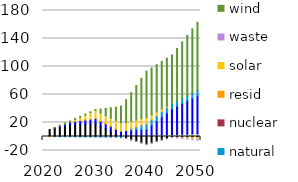
| Category | biomass | coal | hydro | natural gas | nuclear | resid | solar | waste | wind |
|---|---|---|---|---|---|---|---|---|---|
| 2020.0 | 0 | 0 | 0 | 0 | 0 | 0 | 0 | 0 | 0 |
| 2021.0 | -0.135 | 10.005 | 0 | 0 | 0 | 0 | -0.001 | 0 | 0 |
| 2022.0 | -0.102 | 11.573 | 1.099 | -0.141 | 0 | 0 | 0.058 | 0 | 0.353 |
| 2023.0 | -0.068 | 13.14 | 2.198 | -0.282 | 0 | 0 | 0.117 | 0 | 0.706 |
| 2024.0 | -0.034 | 14.707 | 3.297 | -0.423 | 0 | 0 | 0.176 | 0 | 1.059 |
| 2025.0 | 0 | 16.275 | 4.395 | -0.564 | 0 | 0 | 0.235 | 0 | 1.412 |
| 2026.0 | 0.158 | 16.477 | 5.03 | -0.647 | 0 | 0.06 | 2.461 | 0 | 1.391 |
| 2027.0 | 0.315 | 16.679 | 5.665 | -0.73 | 0 | 0.12 | 4.687 | 0 | 1.37 |
| 2028.0 | 0.473 | 16.882 | 6.3 | -0.814 | 0 | 0.18 | 6.914 | 0 | 1.35 |
| 2029.0 | 0.63 | 17.084 | 6.935 | -0.897 | 0 | 0.24 | 9.14 | 0 | 1.329 |
| 2030.0 | 0.788 | 17.286 | 7.569 | -0.98 | 0 | 0.3 | 11.366 | 0 | 1.308 |
| 2031.0 | 0.805 | 13.717 | 7.392 | -1.046 | 0.031 | 0.24 | 11.475 | 0 | 5.805 |
| 2032.0 | 0.822 | 10.148 | 7.215 | -1.112 | 0.063 | 0.18 | 11.584 | 0 | 10.301 |
| 2033.0 | 0.839 | 6.58 | 7.038 | -1.178 | 0.094 | 0.12 | 11.694 | 0 | 14.798 |
| 2034.0 | 0.856 | 3.011 | 6.861 | -1.243 | 0.125 | 0.06 | 11.803 | 0 | 19.295 |
| 2035.0 | 0.873 | -0.558 | 6.684 | -1.309 | 0.157 | 0 | 11.912 | 0 | 23.792 |
| 2036.0 | 1.042 | -2.646 | 7.041 | 0.555 | 0.125 | 0 | 11.308 | -0.105 | 32.291 |
| 2037.0 | 1.211 | -4.733 | 7.397 | 2.419 | 0.094 | 0 | 10.703 | -0.21 | 40.791 |
| 2038.0 | 1.38 | -6.821 | 7.754 | 4.284 | 0.063 | 0 | 10.098 | -0.315 | 49.29 |
| 2039.0 | 1.55 | -8.909 | 8.11 | 6.148 | 0.031 | 0 | 9.494 | -0.42 | 57.79 |
| 2040.0 | 1.719 | -10.997 | 8.467 | 8.012 | 0 | 0 | 8.889 | -0.525 | 66.289 |
| 2041.0 | 1.924 | -8.977 | 14.128 | 7.949 | 0 | 0 | 7.157 | -0.552 | 66.844 |
| 2042.0 | 2.129 | -6.957 | 19.79 | 7.886 | 0 | 0 | 5.425 | -0.578 | 67.399 |
| 2043.0 | 2.334 | -4.937 | 25.451 | 7.823 | 0 | 0 | 3.692 | -0.605 | 67.954 |
| 2044.0 | 2.539 | -2.917 | 31.113 | 7.759 | 0 | 0 | 1.96 | -0.631 | 68.508 |
| 2045.0 | 2.745 | -0.897 | 36.774 | 7.696 | 0 | 0 | 0.228 | -0.658 | 69.063 |
| 2046.0 | 2.987 | -0.934 | 40.295 | 7.633 | 0 | 0 | -0.45 | -0.684 | 74.751 |
| 2047.0 | 3.23 | -0.97 | 43.815 | 7.569 | 0 | 0 | -1.129 | -0.711 | 80.439 |
| 2048.0 | 3.472 | -1.006 | 47.336 | 7.506 | 0 | 0 | -1.807 | -0.737 | 86.127 |
| 2049.0 | 3.715 | -1.042 | 50.857 | 7.442 | 0 | 0 | -2.485 | -0.764 | 91.815 |
| 2050.0 | 3.958 | -1.079 | 54.377 | 7.379 | 0 | 0 | -3.163 | -0.791 | 97.503 |